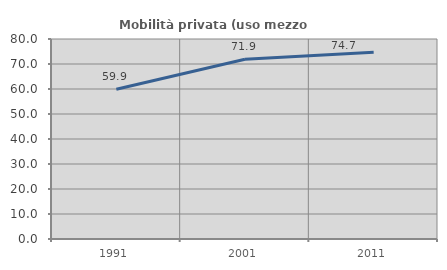
| Category | Mobilità privata (uso mezzo privato) |
|---|---|
| 1991.0 | 59.885 |
| 2001.0 | 71.89 |
| 2011.0 | 74.667 |